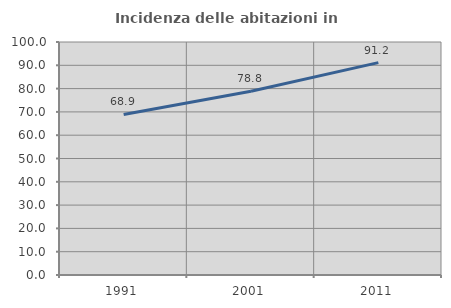
| Category | Incidenza delle abitazioni in proprietà  |
|---|---|
| 1991.0 | 68.927 |
| 2001.0 | 78.836 |
| 2011.0 | 91.156 |